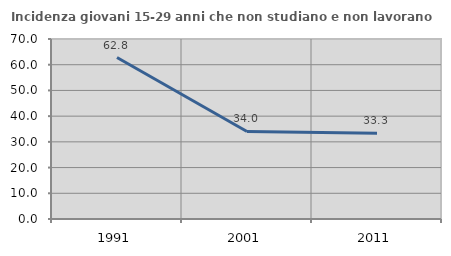
| Category | Incidenza giovani 15-29 anni che non studiano e non lavorano  |
|---|---|
| 1991.0 | 62.782 |
| 2001.0 | 34.043 |
| 2011.0 | 33.333 |